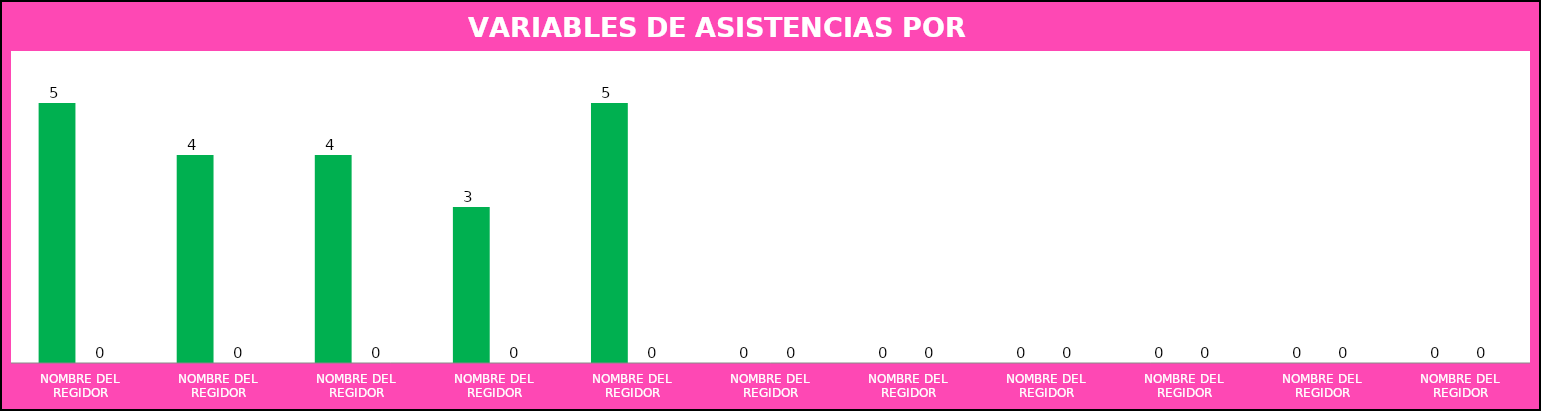
| Category | Series 0 | Series 1 |
|---|---|---|
| NOMBRE DEL REGIDOR | 5 | 0 |
| NOMBRE DEL REGIDOR | 4 | 0 |
| NOMBRE DEL REGIDOR | 4 | 0 |
| NOMBRE DEL REGIDOR | 3 | 0 |
| NOMBRE DEL REGIDOR | 5 | 0 |
| NOMBRE DEL REGIDOR | 0 | 0 |
| NOMBRE DEL REGIDOR | 0 | 0 |
| NOMBRE DEL REGIDOR | 0 | 0 |
| NOMBRE DEL REGIDOR | 0 | 0 |
| NOMBRE DEL REGIDOR | 0 | 0 |
| NOMBRE DEL REGIDOR | 0 | 0 |